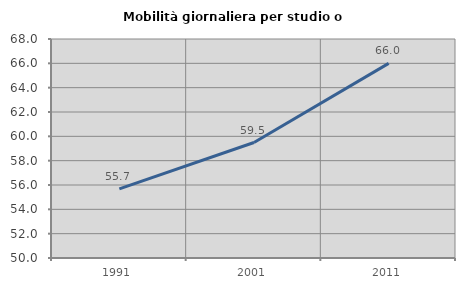
| Category | Mobilità giornaliera per studio o lavoro |
|---|---|
| 1991.0 | 55.685 |
| 2001.0 | 59.492 |
| 2011.0 | 65.995 |